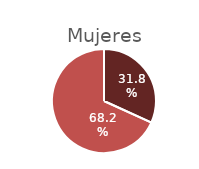
| Category | Mujer |
|---|---|
| 0 | 0.318 |
| 1 | 0.682 |